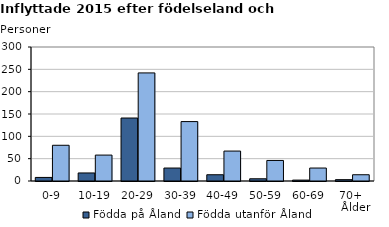
| Category | Födda på Åland | Födda utanför Åland |
|---|---|---|
| 0-9 | 8 | 80 |
| 10-19 | 18 | 58 |
| 20-29 | 141 | 242 |
| 30-39 | 29 | 133 |
| 40-49 | 14 | 67 |
| 50-59 | 5 | 46 |
| 60-69 | 2 | 29 |
| 70+ | 3 | 14 |